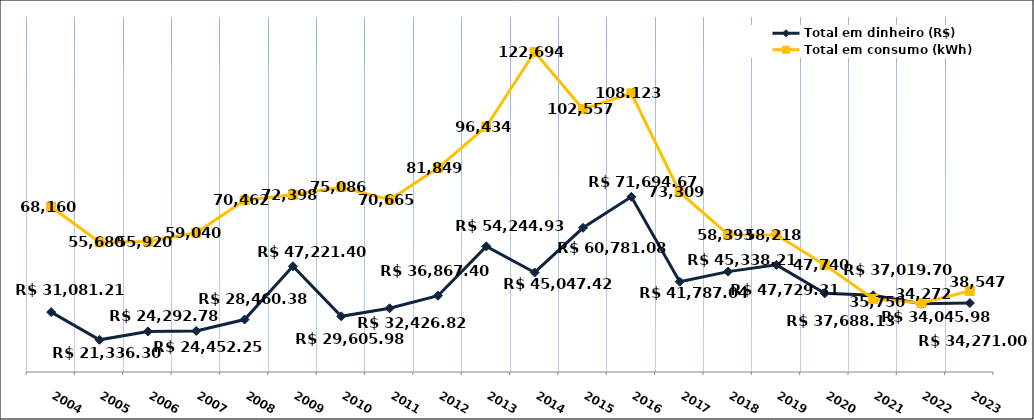
| Category | Total em dinheiro (R$) |
|---|---|
| 2004.0 | 31081.21 |
| 2005.0 | 21336.3 |
| 2006.0 | 24292.78 |
| 2007.0 | 24452.25 |
| 2008.0 | 28460.38 |
| 2009.0 | 47221.4 |
| 2010.0 | 29605.98 |
| 2011.0 | 32426.82 |
| 2012.0 | 36867.4 |
| 2013.0 | 54244.93 |
| 2014.0 | 45047.42 |
| 2015.0 | 60781.08 |
| 2016.0 | 71694.67 |
| 2017.0 | 41787.04 |
| 2018.0 | 45338.21 |
| 2019.0 | 47729.31 |
| 2020.0 | 37688.13 |
| 2021.0 | 37019.7 |
| 2022.0 | 34045.98 |
| 2023.0 | 34271 |